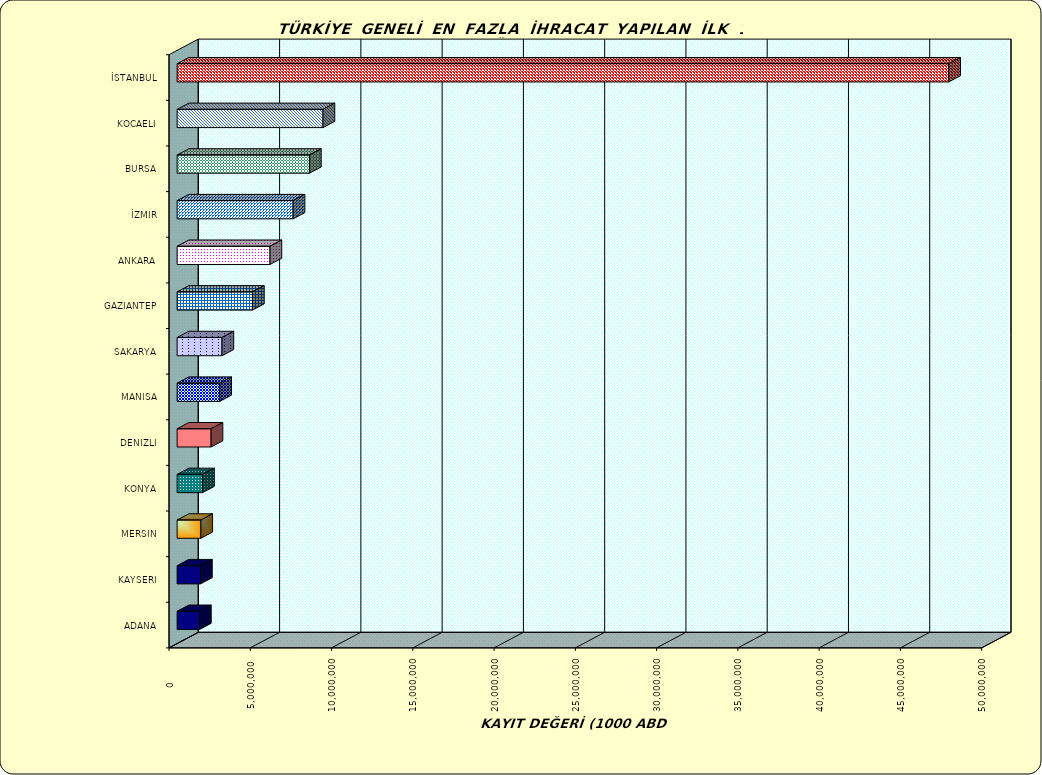
| Category | Series 0 |
|---|---|
| İSTANBUL | 47473879.074 |
| KOCAELI | 8975997.678 |
| BURSA | 8142809.121 |
| İZMIR | 7135640.842 |
| ANKARA | 5714002.594 |
| GAZIANTEP | 4634295.229 |
| SAKARYA | 2760473.105 |
| MANISA | 2624860.047 |
| DENIZLI | 2089323.71 |
| KONYA | 1564284.915 |
| MERSIN | 1459818.548 |
| KAYSERI | 1438370.793 |
| ADANA | 1373788.442 |